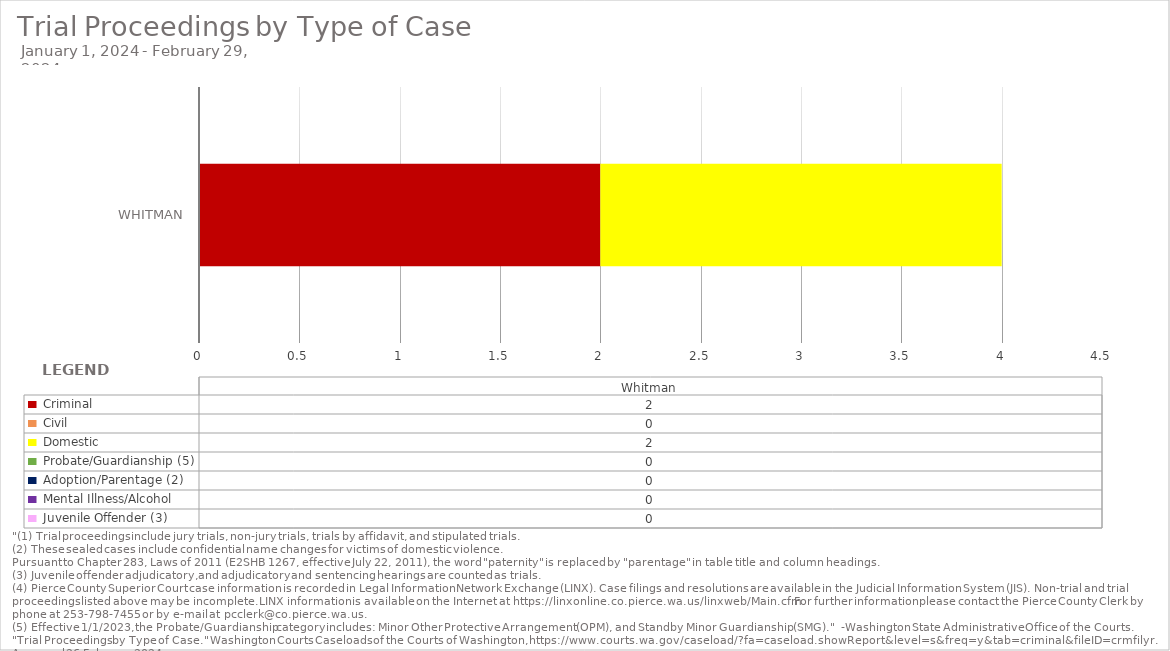
| Category |  Criminal  |  Civil  |  Domestic  |  Probate/Guardianship (5)  |  Adoption/Parentage (2)  |  Mental Illness/Alcohol  |  Juvenile Offender (3)  |
|---|---|---|---|---|---|---|---|
| Whitman | 2 | 0 | 2 | 0 | 0 | 0 | 0 |